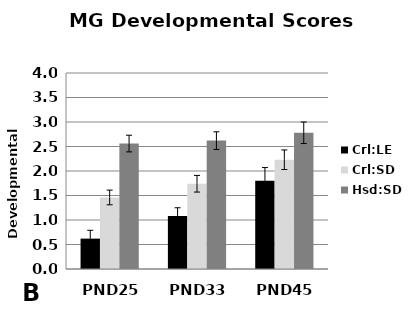
| Category | Crl:LE | Crl:SD | Hsd:SD |
|---|---|---|---|
| PND25 | 0.62 | 1.46 | 2.56 |
| PND33 | 1.08 | 1.74 | 2.62 |
| PND45 | 1.8 | 2.23 | 2.78 |